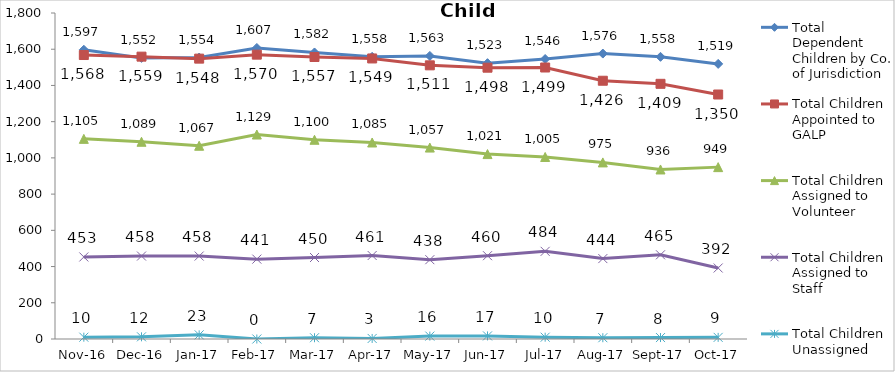
| Category | Total Dependent Children by Co. of Jurisdiction | Total Children Appointed to GALP | Total Children Assigned to Volunteer | Total Children Assigned to Staff | Total Children Unassigned |
|---|---|---|---|---|---|
| 2016-11-01 | 1597 | 1568 | 1105 | 453 | 10 |
| 2016-12-01 | 1552 | 1559 | 1089 | 458 | 12 |
| 2017-01-01 | 1554 | 1548 | 1067 | 458 | 23 |
| 2017-02-01 | 1607 | 1570 | 1129 | 441 | 0 |
| 2017-03-01 | 1582 | 1557 | 1100 | 450 | 7 |
| 2017-04-01 | 1558 | 1549 | 1085 | 461 | 3 |
| 2017-05-01 | 1563 | 1511 | 1057 | 438 | 16 |
| 2017-06-01 | 1523 | 1498 | 1021 | 460 | 17 |
| 2017-07-01 | 1546 | 1499 | 1005 | 484 | 10 |
| 2017-08-01 | 1576 | 1426 | 975 | 444 | 7 |
| 2017-09-01 | 1558 | 1409 | 936 | 465 | 8 |
| 2017-10-01 | 1519 | 1350 | 949 | 392 | 9 |